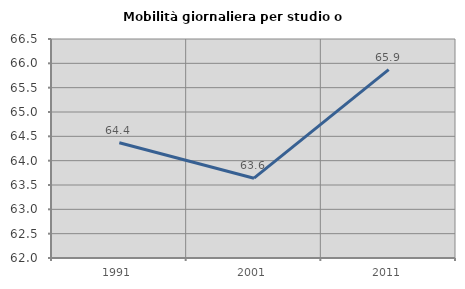
| Category | Mobilità giornaliera per studio o lavoro |
|---|---|
| 1991.0 | 64.369 |
| 2001.0 | 63.64 |
| 2011.0 | 65.87 |